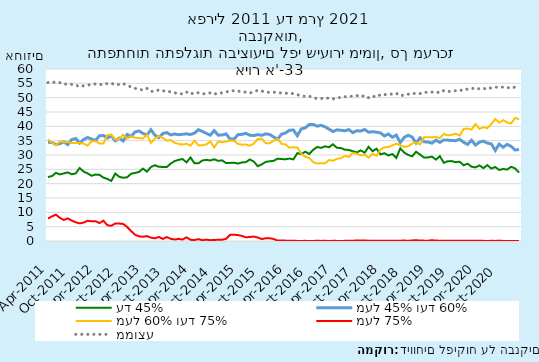
| Category | עד 45% | מעל 45% ועד 60% | מעל 60% ועד 75% | מעל 75%  | ממוצע |
|---|---|---|---|---|---|
| 2011-04-01 | 22.31 | 34.448 | 35.405 | 7.837 | 55.261 |
| 2011-05-01 | 22.647 | 34.385 | 34.396 | 8.572 | 55.509 |
| 2011-06-01 | 23.771 | 33.654 | 33.371 | 9.203 | 55.192 |
| 2011-07-01 | 23.235 | 33.946 | 34.726 | 8.092 | 55.252 |
| 2011-08-01 | 23.572 | 34.616 | 34.468 | 7.344 | 54.677 |
| 2011-09-01 | 23.937 | 33.622 | 34.542 | 7.899 | 54.814 |
| 2011-10-01 | 23.287 | 35.363 | 34.221 | 7.129 | 54.645 |
| 2011-11-01 | 23.569 | 35.745 | 34.145 | 6.541 | 54.432 |
| 2011-12-01 | 25.448 | 34.163 | 34.239 | 6.15 | 53.812 |
| 2012-01-01 | 24.229 | 35.382 | 33.955 | 6.435 | 54.163 |
| 2012-02-01 | 23.58 | 36.102 | 33.272 | 7.047 | 54.339 |
| 2012-03-01 | 22.758 | 35.565 | 34.799 | 6.878 | 54.667 |
| 2012-04-01 | 23.177 | 35.056 | 34.85 | 6.916 | 54.761 |
| 2012-05-01 | 23.079 | 36.692 | 33.984 | 6.245 | 54.438 |
| 2012-06-01 | 22.117 | 36.794 | 33.998 | 7.091 | 54.883 |
| 2012-07-01 | 21.663 | 35.916 | 36.922 | 5.499 | 54.85 |
| 2012-08-01 | 20.956 | 36.66 | 37.074 | 5.31 | 55.012 |
| 2012-09-01 | 23.53 | 34.964 | 35.402 | 6.105 | 54.457 |
| 2012-10-01 | 22.399 | 35.885 | 35.624 | 6.092 | 54.675 |
| 2012-11-01 | 22.052 | 34.889 | 37.116 | 5.943 | 54.901 |
| 2012-12-01 | 22.234 | 37.167 | 35.704 | 4.895 | 54.296 |
| 2013-01-01 | 23.457 | 36.54 | 36.534 | 3.47 | 53.73 |
| 2013-02-01 | 23.739 | 38.022 | 36.053 | 2.185 | 53.246 |
| 2013-03-01 | 24.106 | 38.382 | 35.888 | 1.624 | 52.987 |
| 2013-04-01 | 25.258 | 37.522 | 35.727 | 1.493 | 52.633 |
| 2013-05-01 | 24.172 | 36.972 | 37.14 | 1.715 | 53.237 |
| 2013-06-01 | 25.805 | 38.802 | 34.216 | 1.177 | 52.207 |
| 2013-07-01 | 26.432 | 36.933 | 35.711 | 0.924 | 52.22 |
| 2013-08-01 | 25.879 | 36.058 | 36.653 | 1.409 | 52.718 |
| 2013-09-01 | 25.844 | 37.451 | 35.986 | 0.719 | 52.334 |
| 2013-10-01 | 25.777 | 37.817 | 35.026 | 1.38 | 52.448 |
| 2013-11-01 | 26.999 | 37.022 | 35.212 | 0.767 | 51.943 |
| 2013-12-01 | 27.882 | 37.327 | 34.26 | 0.531 | 51.68 |
| 2014-01-01 | 28.304 | 37.07 | 33.882 | 0.744 | 51.508 |
| 2014-02-01 | 28.595 | 37.235 | 33.667 | 0.503 | 51.261 |
| 2014-03-01 | 27.42 | 37.383 | 33.911 | 1.286 | 51.976 |
| 2014-04-01 | 29.15 | 37.15 | 33.276 | 0.424 | 51.192 |
| 2014-05-01 | 27.127 | 37.617 | 34.938 | 0.317 | 51.805 |
| 2014-06-01 | 27.084 | 38.831 | 33.429 | 0.656 | 51.689 |
| 2014-07-01 | 28.104 | 38.19 | 33.434 | 0.272 | 51.349 |
| 2014-08-01 | 28.281 | 37.557 | 33.7 | 0.463 | 51.359 |
| 2014-09-01 | 28.102 | 36.91 | 34.698 | 0.291 | 51.679 |
| 2014-10-01 | 28.493 | 38.508 | 32.664 | 0.335 | 51.171 |
| 2014-11-01 | 27.956 | 36.921 | 34.662 | 0.461 | 51.684 |
| 2014-12-01 | 28.134 | 36.969 | 34.464 | 0.433 | 51.631 |
| 2015-01-01 | 27.175 | 37.359 | 34.691 | 0.774 | 51.944 |
| 2015-02-01 | 27.242 | 35.583 | 35.03 | 2.144 | 52.467 |
| 2015-03-01 | 27.305 | 35.539 | 34.973 | 2.183 | 52.367 |
| 2015-04-01 | 27.007 | 37.098 | 33.825 | 2.069 | 52.285 |
| 2015-05-01 | 27.413 | 37.208 | 33.608 | 1.77 | 52.074 |
| 2015-06-01 | 27.525 | 37.55 | 33.647 | 1.278 | 51.906 |
| 2015-07-01 | 28.443 | 36.887 | 33.258 | 1.413 | 51.619 |
| 2015-08-01 | 27.718 | 36.759 | 33.976 | 1.547 | 52.101 |
| 2015-09-01 | 26.093 | 37.12 | 35.564 | 1.224 | 52.54 |
| 2015-10-01 | 26.733 | 36.863 | 35.731 | 0.673 | 52.34 |
| 2015-11-01 | 27.588 | 37.375 | 34.078 | 0.959 | 51.87 |
| 2015-12-01 | 27.811 | 37.162 | 34.061 | 0.967 | 51.874 |
| 2016-01-01 | 27.947 | 36.305 | 35.038 | 0.709 | 51.941 |
| 2016-02-01 | 28.711 | 35.515 | 35.635 | 0.139 | 51.733 |
| 2016-03-01 | 28.584 | 37.276 | 33.939 | 0.202 | 51.629 |
| 2016-04-01 | 28.508 | 37.681 | 33.684 | 0.127 | 51.558 |
| 2016-05-01 | 28.762 | 38.631 | 32.529 | 0.078 | 51.422 |
| 2016-06-01 | 28.471 | 38.732 | 32.737 | 0.061 | 51.446 |
| 2016-07-01 | 30.636 | 36.731 | 32.594 | 0.039 | 51.008 |
| 2016-08-01 | 30.341 | 39.126 | 30.5 | 0.034 | 50.733 |
| 2016-09-01 | 31.155 | 39.463 | 29.333 | 0.049 | 50.426 |
| 2016-10-01 | 30.356 | 40.637 | 28.996 | 0.011 | 50.527 |
| 2016-11-01 | 31.808 | 40.666 | 27.512 | 0.013 | 50.009 |
| 2016-12-01 | 32.809 | 40.051 | 27.036 | 0.104 | 49.689 |
| 2017-01-01 | 32.48 | 40.335 | 27.149 | 0.036 | 49.774 |
| 2017-02-01 | 33.026 | 39.833 | 27.076 | 0.065 | 49.615 |
| 2017-03-01 | 32.715 | 39.027 | 28.253 | 0.006 | 49.931 |
| 2017-04-01 | 33.745 | 38.184 | 28.005 | 0.066 | 49.549 |
| 2017-05-01 | 32.495 | 38.771 | 28.695 | 0.039 | 50.032 |
| 2017-06-01 | 32.461 | 38.637 | 28.889 | 0.013 | 50.022 |
| 2017-07-01 | 31.839 | 38.448 | 29.666 | 0.046 | 50.344 |
| 2017-08-01 | 31.775 | 38.856 | 29.325 | 0.045 | 50.341 |
| 2017-09-01 | 31.318 | 37.81 | 30.776 | 0.096 | 50.569 |
| 2017-10-01 | 30.877 | 38.46 | 30.469 | 0.193 | 50.756 |
| 2017-11-01 | 31.605 | 38.363 | 29.884 | 0.148 | 50.309 |
| 2017-12-01 | 30.806 | 38.903 | 30.115 | 0.175 | 50.731 |
| 2018-01-01 | 32.862 | 37.954 | 29.076 | 0.107 | 49.97 |
| 2018-02-01 | 31.315 | 38.136 | 30.419 | 0.131 | 50.554 |
| 2018-03-01 | 32.205 | 37.962 | 29.74 | 0.092 | 50.204 |
| 2018-04-01 | 30.213 | 37.705 | 31.972 | 0.11 | 51.097 |
| 2018-05-01 | 30.625 | 36.631 | 32.679 | 0.065 | 51.058 |
| 2018-06-01 | 29.825 | 37.334 | 32.772 | 0.07 | 51.242 |
| 2018-07-01 | 30.342 | 36.196 | 33.365 | 0.096 | 51.252 |
| 2018-08-01 | 28.985 | 36.949 | 33.979 | 0.088 | 51.532 |
| 2018-09-01 | 32.29 | 34.296 | 33.296 | 0.118 | 50.624 |
| 2018-10-01 | 30.837 | 36.171 | 32.835 | 0.157 | 50.949 |
| 2018-11-01 | 30.021 | 36.881 | 33.024 | 0.074 | 51.215 |
| 2018-12-01 | 29.546 | 36.262 | 33.984 | 0.208 | 51.538 |
| 2019-01-01 | 31.14 | 34.208 | 34.408 | 0.245 | 51.354 |
| 2019-02-01 | 30.127 | 35.983 | 33.705 | 0.184 | 51.412 |
| 2019-03-01 | 29.104 | 34.588 | 36.182 | 0.126 | 51.856 |
| 2019-04-01 | 29.155 | 34.549 | 36.208 | 0.089 | 51.862 |
| 2019-05-01 | 29.416 | 34.111 | 36.193 | 0.28 | 51.951 |
| 2019-06-01 | 28.4 | 35.186 | 36.268 | 0.146 | 52.035 |
| 2019-07-01 | 29.583 | 34.394 | 35.911 | 0.112 | 51.689 |
| 2019-08-01 | 27.274 | 35.267 | 37.328 | 0.13 | 52.5 |
| 2019-09-01 | 27.839 | 35.206 | 36.847 | 0.107 | 52.17 |
| 2019-10-01 | 27.871 | 35.037 | 37.029 | 0.063 | 52.21 |
| 2019-11-01 | 27.472 | 35 | 37.433 | 0.095 | 52.428 |
| 2019-12-01 | 27.668 | 35.488 | 36.773 | 0.072 | 52.356 |
| 2020-01-01 | 26.428 | 34.428 | 39.081 | 0.063 | 52.98 |
| 2020-02-01 | 26.969 | 33.697 | 39.231 | 0.104 | 52.937 |
| 2020-03-01 | 25.92 | 35.163 | 38.85 | 0.067 | 53.115 |
| 2020-04-01 | 25.669 | 33.47 | 40.797 | 0.064 | 53.452 |
| 2020-05-01 | 26.373 | 34.463 | 39.1 | 0.064 | 53.044 |
| 2020-06-01 | 25.417 | 34.83 | 39.705 | 0.048 | 53.245 |
| 2020-07-01 | 26.455 | 34.156 | 39.366 | 0.022 | 52.973 |
| 2020-08-01 | 25.285 | 33.868 | 40.792 | 0.055 | 53.456 |
| 2020-09-01 | 25.813 | 31.579 | 42.573 | 0.035 | 53.663 |
| 2020-10-01 | 24.777 | 33.794 | 41.299 | 0.129 | 53.669 |
| 2020-11-01 | 25.116 | 32.709 | 42.152 | 0.023 | 53.663 |
| 2020-12-01 | 24.922 | 33.698 | 41.359 | 0.022 | 53.573 |
| 2021-01-01 | 25.9 | 33.037 | 41.023 | 0.04 | 53.284 |
| 2021-02-01 | 25.323 | 31.747 | 42.91 | 0.02 | 53.694 |
| 2021-03-01 | 23.868 | 31.893 | 42.466 | 0.003 | 54.021 |